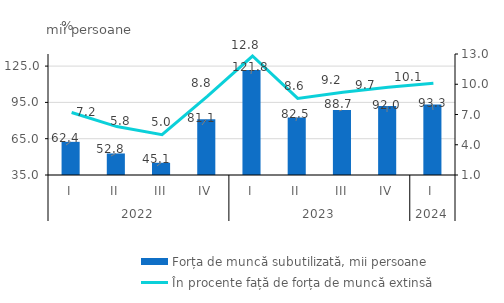
| Category | Forța de muncă subutilizată, mii persoane |
|---|---|
| 0 | 62.4 |
| 1 | 52.8 |
| 2 | 45.1 |
| 3 | 81.1 |
| 4 | 121.8 |
| 5 | 82.5 |
| 6 | 88.7 |
| 7 | 92 |
| 8 | 93.3 |